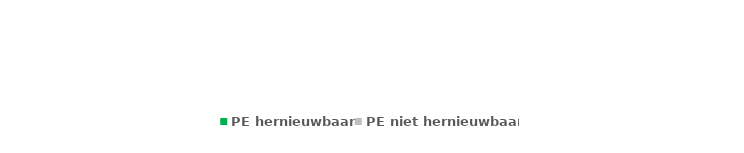
| Category | PE hernieuwbaar | PE niet hernieuwbaar |
|---|---|---|
| 0 | 0 | 0 |